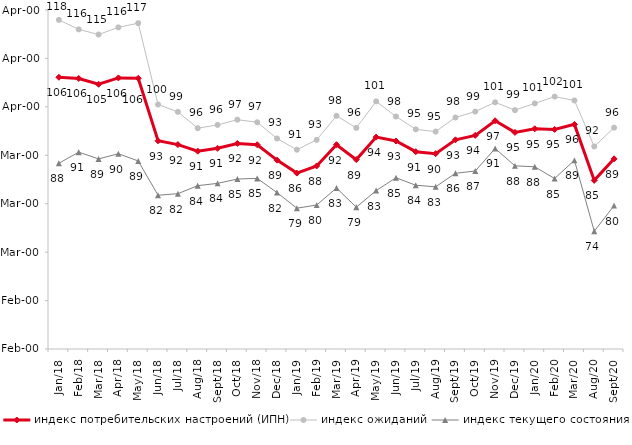
| Category | индекс потребительских настроений (ИПН) | Series 0 | индекс ожиданий | Series 3 | индекс текущего состояния |
|---|---|---|---|---|---|
| 2018-01-01 | 106.11 | 2018-01-01 | 117.95 | 2018-01-01 | 88.35 |
| 2018-02-01 | 105.86 | 2018-02-01 | 116 | 2018-02-01 | 90.65 |
| 2018-03-01 | 104.66 | 2018-03-01 | 114.933 | 2018-03-01 | 89.25 |
| 2018-04-01 | 105.98 | 2018-04-01 | 116.417 | 2018-04-01 | 90.325 |
| 2018-05-01 | 105.9 | 2018-05-01 | 117.283 | 2018-05-01 | 88.825 |
| 2018-06-01 | 92.99 | 2018-06-01 | 100.483 | 2018-06-01 | 81.75 |
| 2018-07-01 | 92.21 | 2018-07-01 | 98.967 | 2018-07-01 | 82.075 |
| 2018-08-01 | 90.85 | 2018-08-01 | 95.6 | 2018-08-01 | 83.725 |
| 2018-09-01 | 91.44 | 2018-09-01 | 96.267 | 2018-09-01 | 84.2 |
| 2018-10-01 | 92.45 | 2018-10-01 | 97.35 | 2018-10-01 | 85.1 |
| 2018-11-01 | 92.186 | 2018-11-01 | 96.823 | 2018-11-01 | 85.23 |
| 2018-12-01 | 89 | 2018-12-01 | 93.467 | 2018-12-01 | 82.3 |
| 2019-01-01 | 86.32 | 2019-01-01 | 91.15 | 2019-01-01 | 79.075 |
| 2019-02-01 | 87.8 | 2019-02-01 | 93.183 | 2019-02-01 | 79.725 |
| 2019-03-01 | 92.183 | 2019-03-01 | 98.144 | 2019-03-01 | 83.242 |
| 2019-04-01 | 89.109 | 2019-04-01 | 95.66 | 2019-04-01 | 79.282 |
| 2019-05-01 | 93.759 | 2019-05-01 | 101.123 | 2019-05-01 | 82.714 |
| 2019-06-01 | 92.948 | 2019-06-01 | 98.005 | 2019-06-01 | 85.362 |
| 2019-07-01 | 90.743 | 2019-07-01 | 95.363 | 2019-07-01 | 83.812 |
| 2019-08-01 | 90.33 | 2019-08-01 | 94.888 | 2019-08-01 | 83.492 |
| 2019-09-01 | 93.198 | 2019-09-01 | 97.805 | 2019-09-01 | 86.287 |
| 2019-10-01 | 94.119 | 2019-10-01 | 99.026 | 2019-10-01 | 86.757 |
| 2019-11-01 | 97.129 | 2019-11-01 | 100.941 | 2019-11-01 | 91.411 |
| 2019-12-01 | 94.723 | 2019-12-01 | 99.323 | 2019-12-01 | 87.822 |
| 2020-01-01 | 95.475 | 2020-01-01 | 100.71 | 2020-01-01 | 87.624 |
| 2020-02-01 | 95.347 | 2020-02-01 | 102.112 | 2020-02-01 | 85.198 |
| 2020-03-01 | 96.381 | 2020-03-01 | 101.322 | 2020-03-01 | 88.969 |
| 2020-08-01 | 84.816 | 2020-08-01 | 91.824 | 2020-08-01 | 74.305 |
| 2020-09-01 | 89.268 | 2020-09-01 | 95.703 | 2020-09-01 | 79.617 |